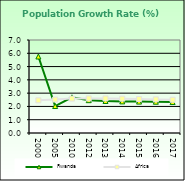
| Category | Rwanda | Africa  |
|---|---|---|
| 2000.0 | 5.758 | 2.458 |
| 2005.0 | 2.031 | 2.516 |
| 2010.0 | 2.684 | 2.59 |
| 2012.0 | 2.472 | 2.606 |
| 2013.0 | 2.41 | 2.601 |
| 2014.0 | 2.378 | 2.584 |
| 2015.0 | 2.364 | 2.559 |
| 2016.0 | 2.352 | 2.531 |
| 2017.0 | 2.33 | 2.503 |